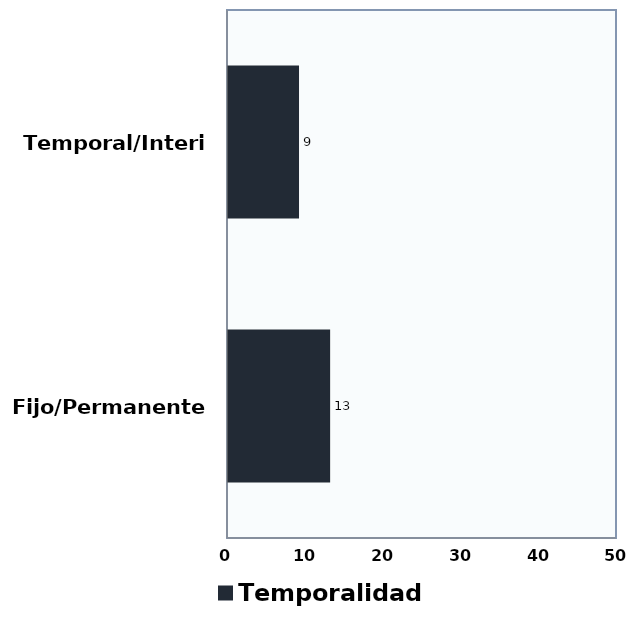
| Category | Temporalidad |
|---|---|
| Fijo/Permanente | 13 |
| Temporal/Interino | 9 |